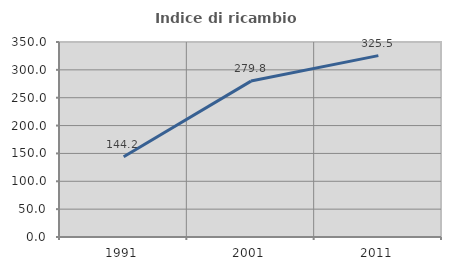
| Category | Indice di ricambio occupazionale  |
|---|---|
| 1991.0 | 144.175 |
| 2001.0 | 279.845 |
| 2011.0 | 325.532 |